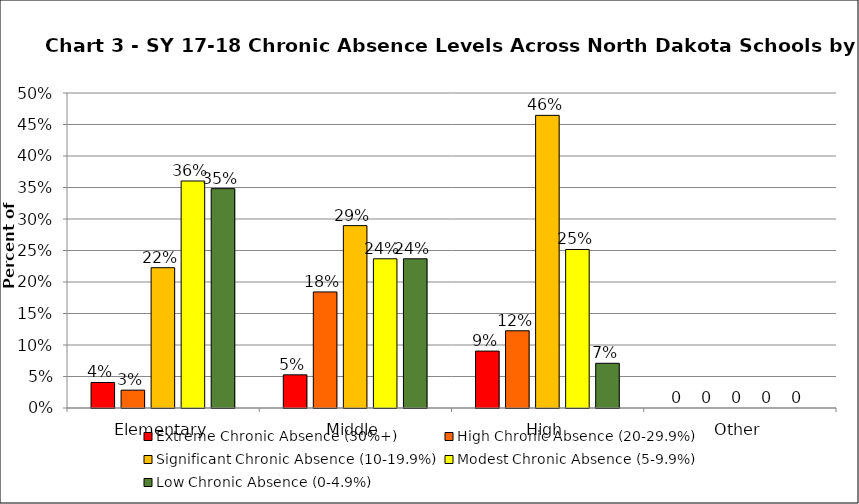
| Category | Extreme Chronic Absence (30%+) | High Chronic Absence (20-29.9%) | Significant Chronic Absence (10-19.9%) | Modest Chronic Absence (5-9.9%) | Low Chronic Absence (0-4.9%) |
|---|---|---|---|---|---|
| 0 | 0.04 | 0.028 | 0.223 | 0.36 | 0.348 |
| 1 | 0.053 | 0.184 | 0.289 | 0.237 | 0.237 |
| 2 | 0.09 | 0.123 | 0.465 | 0.252 | 0.071 |
| 3 | 0 | 0 | 0 | 0 | 0 |